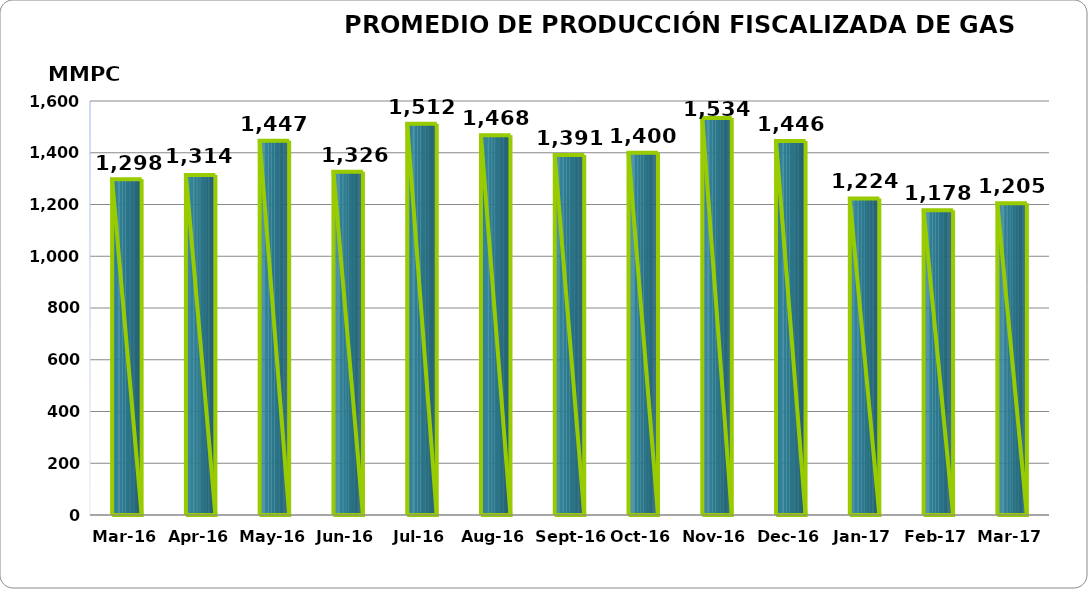
| Category | Series 0 |
|---|---|
| 2016-03-01 | 1297819.673 |
| 2016-04-01 | 1313613.867 |
| 2016-05-01 | 1446528.161 |
| 2016-06-01 | 1326088.967 |
| 2016-07-01 | 1512372 |
| 2016-08-01 | 1468104.525 |
| 2016-09-01 | 1391000.053 |
| 2016-10-01 | 1400096.432 |
| 2016-11-01 | 1534268.686 |
| 2016-12-01 | 1445701.779 |
| 2017-01-01 | 1223514.523 |
| 2017-02-01 | 1177591.973 |
| 2017-03-01 | 1204775.201 |